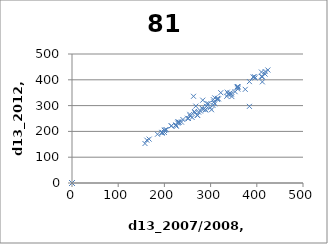
| Category | Series 0 |
|---|---|
| 0.0 | 0 |
| 224.0 | 223 |
| 240.0 | 246 |
| 278.0 | 279 |
| 359.0 | 370 |
| 229.0 | 237 |
| 418.0 | 422 |
| 195.0 | 196 |
| 359.0 | 364 |
| 0.0 | 0 |
| 315.0 | 328 |
| 231.0 | 235 |
| 338.0 | 344 |
| 0.0 | 0 |
| 342.0 | 349 |
| 424.0 | 438 |
| 0.0 | 0 |
| 289.0 | 283 |
| 0.0 | 0 |
| 263.0 | 336 |
| 0.0 | 0 |
| 252.0 | 250 |
| 255.0 | 266 |
| 412.0 | 392 |
| 0.0 | 0 |
| 395.0 | 412 |
| 315.0 | 324 |
| 272.0 | 262 |
| 289.0 | 285 |
| 305.0 | 301 |
| 200.0 | 196 |
| 396.0 | 407 |
| 345.0 | 345 |
| 410.0 | 413 |
| 0.0 | 0 |
| 0.0 | 0 |
| 0.0 | 0 |
| 0.0 | 0 |
| 260.0 | 254 |
| 295.0 | 307 |
| 384.0 | 393 |
| 410.0 | 430 |
| 0.0 | 0 |
| 265.0 | 277 |
| 343.0 | 345 |
| 322.0 | 350 |
| 384.0 | 297 |
| 271.0 | 263 |
| 335.0 | 336 |
| 412.0 | 412 |
| 336.0 | 352 |
| 418.0 | 432 |
| 359.0 | 374 |
| 226.0 | 220 |
| 292.0 | 308 |
| 359.0 | 373 |
| 375.0 | 363 |
| 302.0 | 284 |
| 0.0 | 0 |
| 283.0 | 321 |
| 0.0 | 0 |
| 256.0 | 260 |
| 299.0 | 292 |
| 353.0 | 354 |
| 306.0 | 323 |
| 250.0 | 251 |
| 291.0 | 297 |
| 284.0 | 285 |
| 346.0 | 335 |
| 392.0 | 411 |
| 317.0 | 326 |
| 357.0 | 372 |
| 309.0 | 307 |
| 307.0 | 314 |
| 274.0 | 275 |
| 281.0 | 291 |
| 309.0 | 330 |
| 268.0 | 298 |
| 0.0 | 0 |
| 158.0 | 153 |
| 225.0 | 225 |
| 202.0 | 206 |
| 167.0 | 170 |
| 195.0 | 196 |
| 237.0 | 236 |
| 266.0 | 272 |
| 200.0 | 204 |
| 204.0 | 207 |
| 229.0 | 232 |
| 215.0 | 222 |
| 215.0 | 221 |
| 195.0 | 193 |
| 232.0 | 236 |
| 200.0 | 204 |
| 162.0 | 166 |
| 185.0 | 189 |
| 0.0 | 0 |
| 0.0 | 0 |
| 0.0 | 0 |
| 0.0 | 0 |
| 0.0 | 0 |
| 0.0 | 0 |
| 0.0 | 0 |